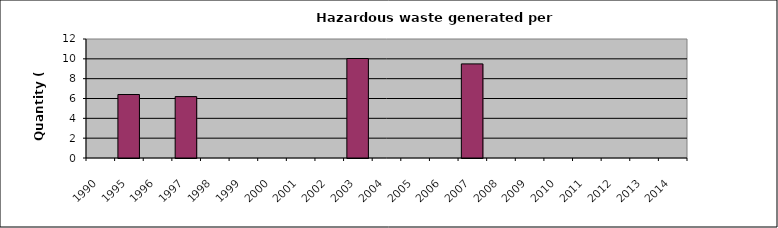
| Category | Series 1 |
|---|---|
| 1990.0 | 0 |
| 1995.0 | 6.4 |
| 1996.0 | 0 |
| 1997.0 | 6.19 |
| 1998.0 | 0 |
| 1999.0 | 0 |
| 2000.0 | 0 |
| 2001.0 | 0 |
| 2002.0 | 0 |
| 2003.0 | 10.032 |
| 2004.0 | 0 |
| 2005.0 | 0 |
| 2006.0 | 0 |
| 2007.0 | 9.489 |
| 2008.0 | 0 |
| 2009.0 | 0 |
| 2010.0 | 0 |
| 2011.0 | 0 |
| 2012.0 | 0 |
| 2013.0 | 0 |
| 2014.0 | 0 |